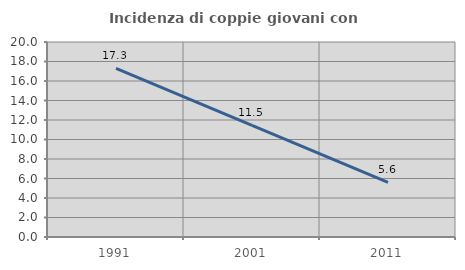
| Category | Incidenza di coppie giovani con figli |
|---|---|
| 1991.0 | 17.29 |
| 2001.0 | 11.458 |
| 2011.0 | 5.594 |